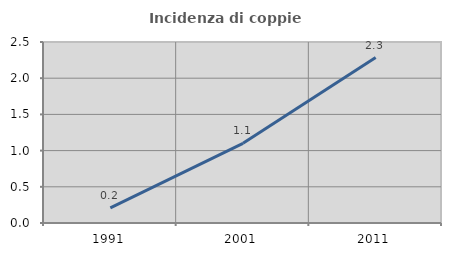
| Category | Incidenza di coppie miste |
|---|---|
| 1991.0 | 0.21 |
| 2001.0 | 1.1 |
| 2011.0 | 2.284 |